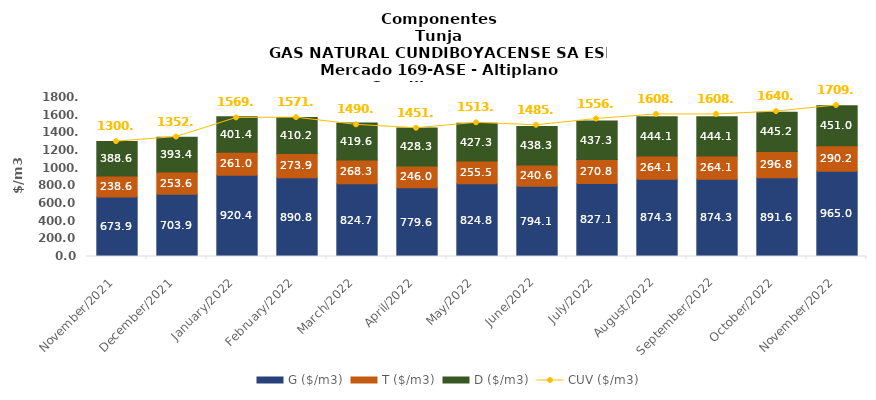
| Category | G ($/m3) | T ($/m3) | D ($/m3) |
|---|---|---|---|
| 2021-11-01 | 673.86 | 238.56 | 388.58 |
| 2021-12-01 | 703.86 | 253.6 | 393.37 |
| 2022-01-01 | 920.37 | 261.03 | 401.37 |
| 2022-02-01 | 890.8 | 273.9 | 410.23 |
| 2022-03-01 | 824.74 | 268.34 | 419.57 |
| 2022-04-01 | 779.6 | 246.02 | 428.28 |
| 2022-05-01 | 824.78 | 255.51 | 427.34 |
| 2022-06-01 | 794.08 | 240.57 | 438.25 |
| 2022-07-01 | 827.1 | 270.77 | 437.28 |
| 2022-08-01 | 874.34 | 264.11 | 444.06 |
| 2022-09-01 | 874.34 | 264.11 | 444.06 |
| 2022-10-01 | 891.55 | 296.77 | 445.21 |
| 2022-11-01 | 964.95 | 290.22 | 450.99 |